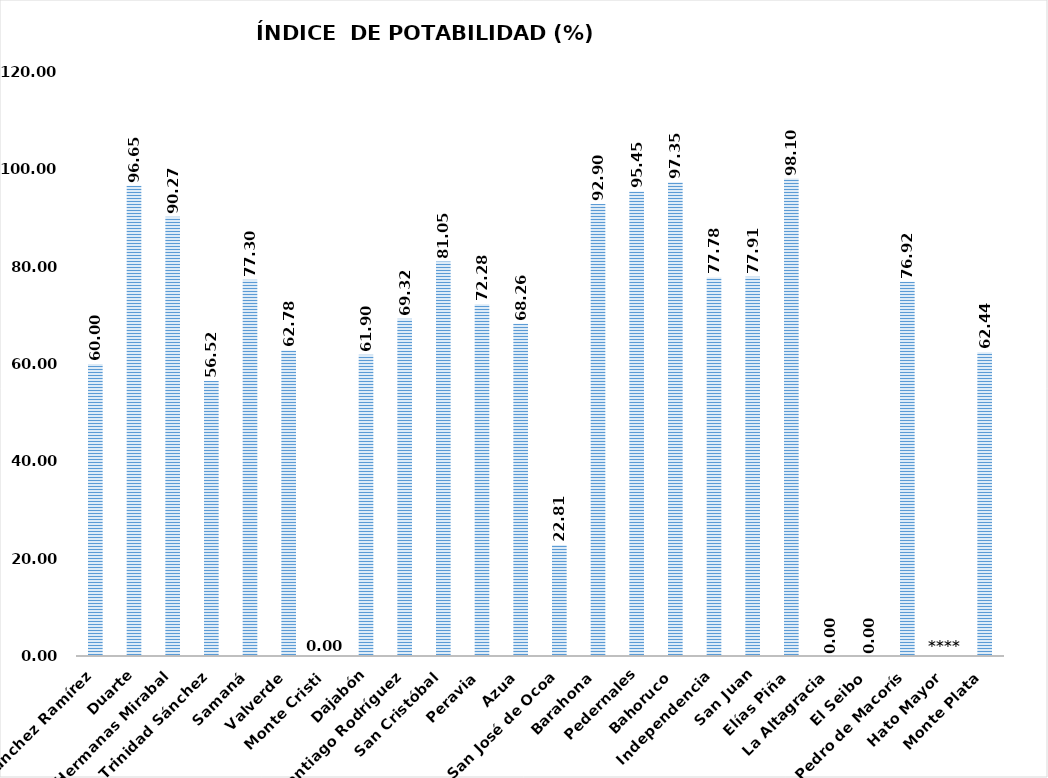
| Category | 60.00  |
|---|---|
| Sánchez Ramírez | 60 |
| Duarte | 96.65 |
| Hermanas Mirabal | 90.27 |
| María Trinidad Sánchez | 56.52 |
| Samaná | 77.3 |
| Valverde | 62.78 |
| Monte Cristi | 0 |
| Dajabón | 61.9 |
| Santiago Rodríguez | 69.32 |
| San Cristóbal | 81.05 |
| Peravia | 72.28 |
| Azua | 68.26 |
| San José de Ocoa | 22.81 |
| Barahona | 92.9 |
| Pedernales | 95.45 |
| Bahoruco | 97.35 |
| Independencia | 77.78 |
| San Juan | 77.91 |
| Elías Piña | 98.1 |
| La Altagracia | 0 |
| El Seibo | 0 |
| San Pedro de Macorís | 76.92 |
| Hato Mayor | 0 |
| Monte Plata | 62.44 |